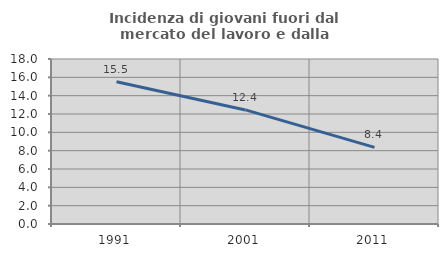
| Category | Incidenza di giovani fuori dal mercato del lavoro e dalla formazione  |
|---|---|
| 1991.0 | 15.517 |
| 2001.0 | 12.444 |
| 2011.0 | 8.357 |